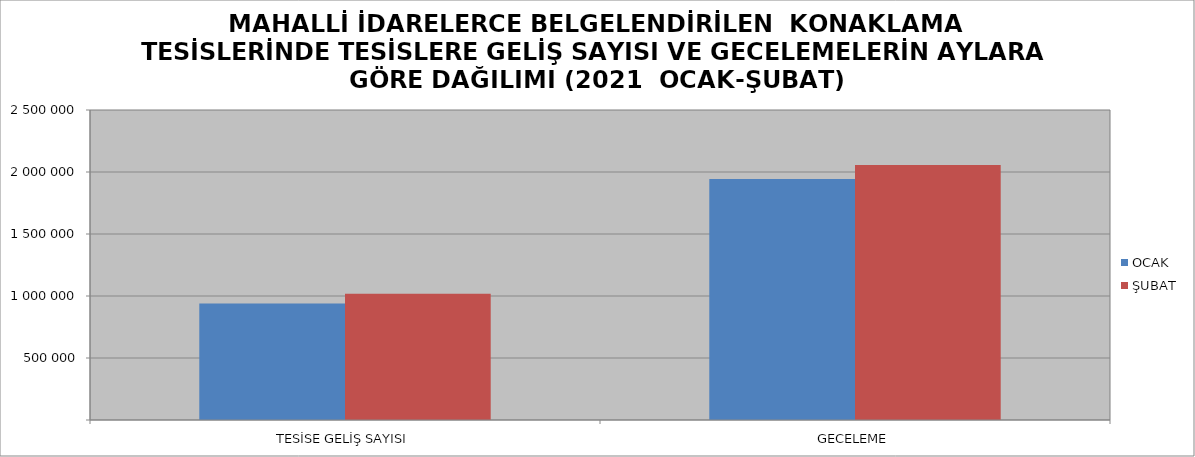
| Category | OCAK | ŞUBAT |
|---|---|---|
| TESİSE GELİŞ SAYISI | 940331 | 1017199 |
| GECELEME | 1943007 | 2056594 |